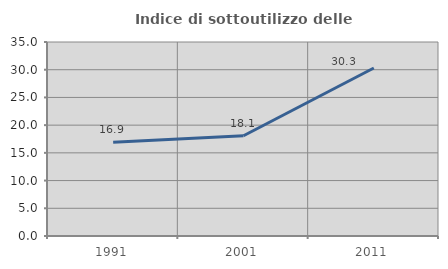
| Category | Indice di sottoutilizzo delle abitazioni  |
|---|---|
| 1991.0 | 16.901 |
| 2001.0 | 18.081 |
| 2011.0 | 30.303 |